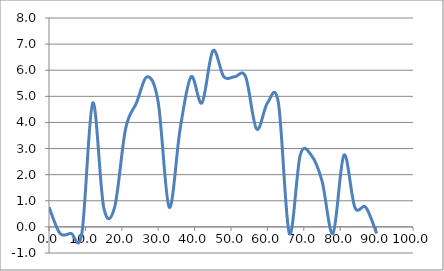
| Category | Elevation (in.) |
|---|---|
| 0.024 | 0.75 |
| 3.024 | -0.25 |
| 6.024 | -0.25 |
| 9.024000000000001 | -0.25 |
| 12.024000000000001 | 4.75 |
| 15.024000000000001 | 0.75 |
| 18.024 | 0.75 |
| 21.024 | 3.75 |
| 24.023999999999997 | 4.75 |
| 27.023999999999997 | 5.75 |
| 30.023999999999997 | 4.75 |
| 33.024 | 0.75 |
| 36.024 | 3.75 |
| 39.024 | 5.75 |
| 42.024 | 4.75 |
| 45.024 | 6.75 |
| 48.024 | 5.75 |
| 51.024 | 5.75 |
| 54.024 | 5.75 |
| 57.024 | 3.75 |
| 60.024 | 4.75 |
| 63.024 | 4.75 |
| 66.024 | -0.25 |
| 69.024 | 2.75 |
| 72.024 | 2.75 |
| 75.024 | 1.75 |
| 78.024 | -0.25 |
| 81.024 | 2.75 |
| 84.024 | 0.75 |
| 87.024 | 0.75 |
| 90.024 | -0.25 |